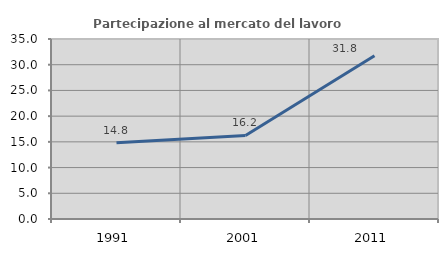
| Category | Partecipazione al mercato del lavoro  femminile |
|---|---|
| 1991.0 | 14.803 |
| 2001.0 | 16.239 |
| 2011.0 | 31.76 |